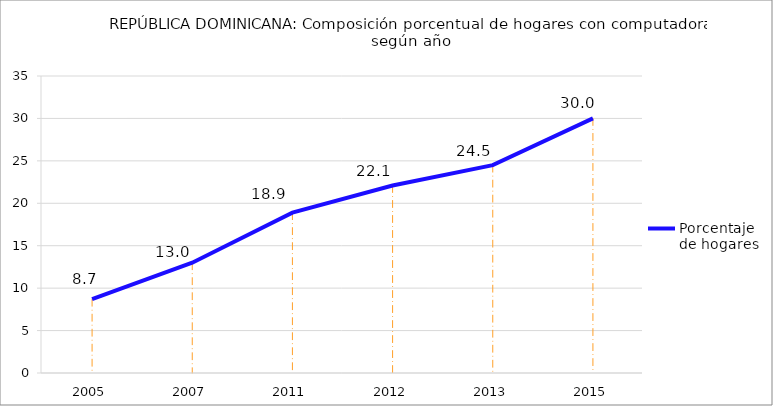
| Category | Porcentaje de hogares |
|---|---|
| 2005.0 | 8.7 |
| 2007.0 | 13 |
| 2011.0 | 18.9 |
| 2012.0 | 22.1 |
| 2013.0 | 24.5 |
| 2015.0 | 30 |